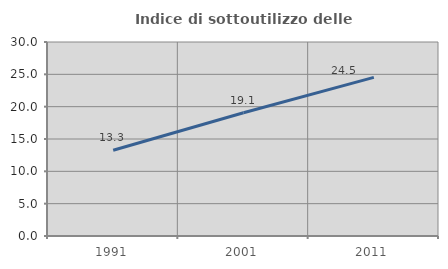
| Category | Indice di sottoutilizzo delle abitazioni  |
|---|---|
| 1991.0 | 13.256 |
| 2001.0 | 19.059 |
| 2011.0 | 24.526 |